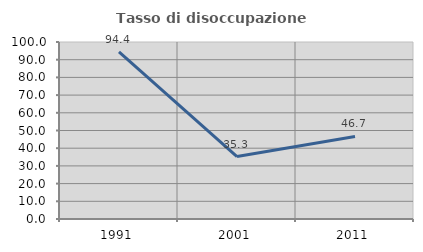
| Category | Tasso di disoccupazione giovanile  |
|---|---|
| 1991.0 | 94.444 |
| 2001.0 | 35.294 |
| 2011.0 | 46.667 |